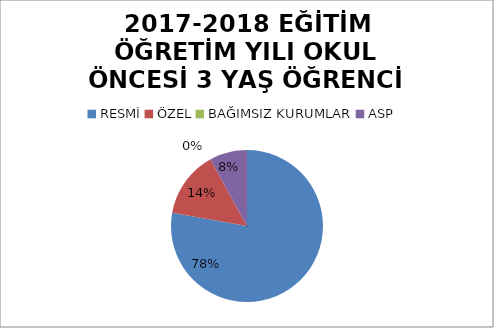
| Category | Series 0 | Series 1 |
|---|---|---|
| RESMİ | 389 |  |
| ÖZEL | 71 |  |
| BAĞIMSIZ KURUMLAR | 0 |  |
| ASP | 40 |  |